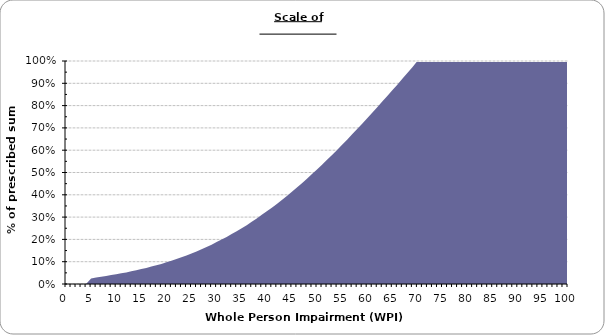
| Category | % of prescribed sum 2015 |
|---|---|
| 0.0 | 0 |
| 1.0 | 0 |
| 2.0 | 0 |
| 3.0 | 0 |
| 4.0 | 0 |
| 5.0 | 0.025 |
| 6.0 | 0.029 |
| 7.0 | 0.032 |
| 8.0 | 0.036 |
| 9.0 | 0.04 |
| 10.0 | 0.044 |
| 11.0 | 0.048 |
| 12.0 | 0.052 |
| 13.0 | 0.057 |
| 14.0 | 0.062 |
| 15.0 | 0.067 |
| 16.0 | 0.072 |
| 17.0 | 0.078 |
| 18.0 | 0.084 |
| 19.0 | 0.09 |
| 20.0 | 0.097 |
| 21.0 | 0.104 |
| 22.0 | 0.112 |
| 23.0 | 0.12 |
| 24.0 | 0.128 |
| 25.0 | 0.137 |
| 26.0 | 0.146 |
| 27.0 | 0.156 |
| 28.0 | 0.166 |
| 29.0 | 0.176 |
| 30.0 | 0.188 |
| 31.0 | 0.199 |
| 32.0 | 0.211 |
| 33.0 | 0.224 |
| 34.0 | 0.237 |
| 35.0 | 0.25 |
| 36.0 | 0.264 |
| 37.0 | 0.279 |
| 38.0 | 0.294 |
| 39.0 | 0.31 |
| 40.0 | 0.326 |
| 41.0 | 0.342 |
| 42.0 | 0.359 |
| 43.0 | 0.377 |
| 44.0 | 0.395 |
| 45.0 | 0.414 |
| 46.0 | 0.433 |
| 47.0 | 0.452 |
| 48.0 | 0.472 |
| 49.0 | 0.493 |
| 50.0 | 0.514 |
| 51.0 | 0.535 |
| 52.0 | 0.557 |
| 53.0 | 0.579 |
| 54.0 | 0.601 |
| 55.0 | 0.625 |
| 56.0 | 0.647 |
| 57.0 | 0.671 |
| 58.0 | 0.695 |
| 59.0 | 0.719 |
| 60.0 | 0.743 |
| 61.0 | 0.768 |
| 62.0 | 0.793 |
| 63.0 | 0.818 |
| 64.0 | 0.843 |
| 65.0 | 0.869 |
| 66.0 | 0.894 |
| 67.0 | 0.92 |
| 68.0 | 0.946 |
| 69.0 | 0.972 |
| 70.0 | 1 |
| 71.0 | 1 |
| 72.0 | 1 |
| 73.0 | 1 |
| 74.0 | 1 |
| 75.0 | 1 |
| 76.0 | 1 |
| 77.0 | 1 |
| 78.0 | 1 |
| 79.0 | 1 |
| 80.0 | 1 |
| 81.0 | 1 |
| 82.0 | 1 |
| 83.0 | 1 |
| 84.0 | 1 |
| 85.0 | 1 |
| 86.0 | 1 |
| 87.0 | 1 |
| 88.0 | 1 |
| 89.0 | 1 |
| 90.0 | 1 |
| 91.0 | 1 |
| 92.0 | 1 |
| 93.0 | 1 |
| 94.0 | 1 |
| 95.0 | 1 |
| 96.0 | 1 |
| 97.0 | 1 |
| 98.0 | 1 |
| 99.0 | 1 |
| 100.0 | 1 |